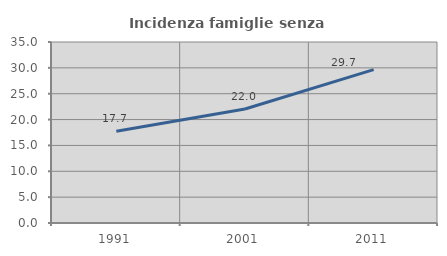
| Category | Incidenza famiglie senza nuclei |
|---|---|
| 1991.0 | 17.733 |
| 2001.0 | 22.047 |
| 2011.0 | 29.651 |